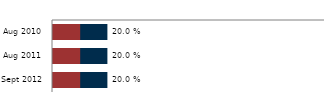
| Category | Global stunting | Severe stunting |
|---|---|---|
| 2010-08-01 | 0.2 | 0.1 |
| 2011-08-01 | 0.2 | 0.1 |
| 2012-09-01 | 0.2 | 0.1 |